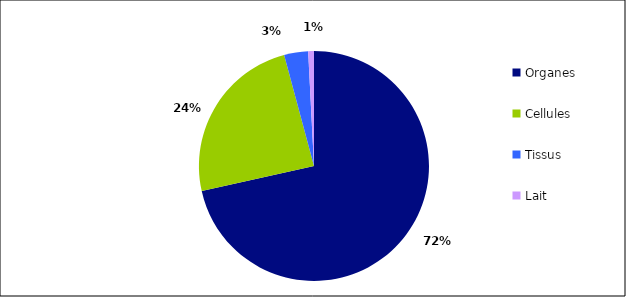
| Category | Nombres de déclarations  | I | I et EI | EI |
|---|---|---|---|---|
| Organes  | 530 | 188 | 0 | 342 |
| Cellules | 180 | 129 | 5 | 46 |
| Tissus  | 25 | 18 | 0 | 7 |
| Lait | 6 | 4 | 0 | 2 |